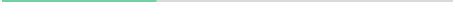
| Category | Series 0 |
|---|---|
| 0 | 0.34 |